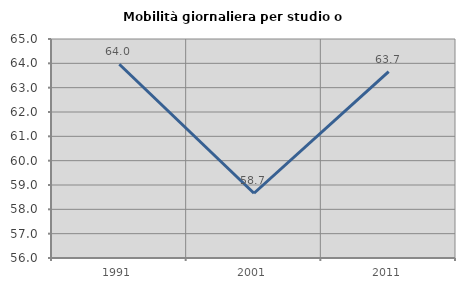
| Category | Mobilità giornaliera per studio o lavoro |
|---|---|
| 1991.0 | 63.964 |
| 2001.0 | 58.661 |
| 2011.0 | 63.658 |